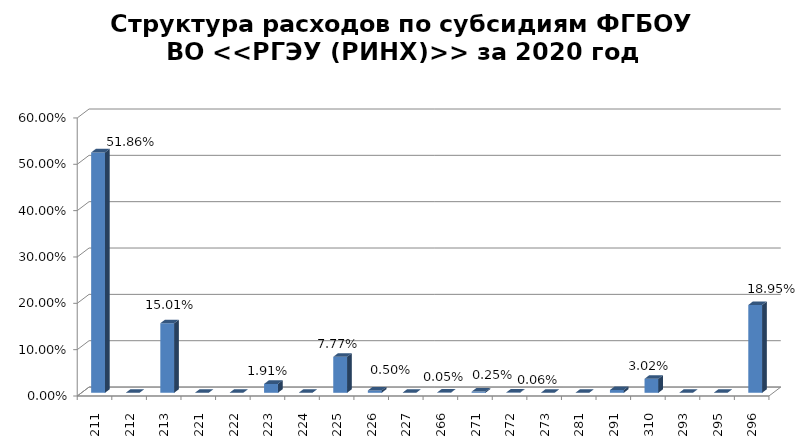
| Category | Series 0 |
|---|---|
|  211 | 0.519 |
|  212 | 0 |
|  213 | 0.15 |
|  221 | 0 |
|  222 | 0 |
|  223 | 0.019 |
|  224 | 0 |
|  225 | 0.078 |
|  226 | 0.005 |
| 227 | 0 |
| 266 | 0.001 |
| 271 | 0.003 |
| 272 | 0.001 |
| 273 | 0 |
| 281 | 0 |
| 291 | 0.006 |
| 310 | 0.03 |
| 293 | 0 |
| 295 | 0 |
| 296 | 0.19 |